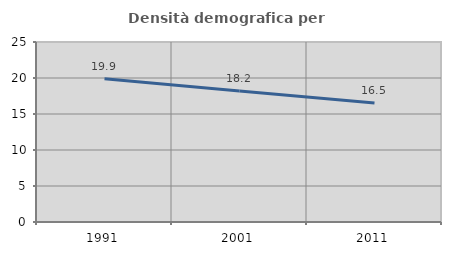
| Category | Densità demografica |
|---|---|
| 1991.0 | 19.894 |
| 2001.0 | 18.204 |
| 2011.0 | 16.537 |